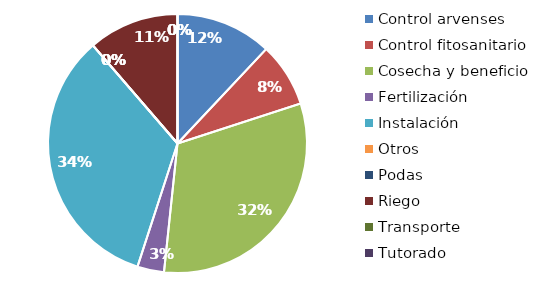
| Category | Valor |
|---|---|
| Control arvenses | 720000 |
| Control fitosanitario | 480000 |
| Cosecha y beneficio | 1900000 |
| Fertilización | 200000 |
| Instalación | 2020000 |
| Otros | 0 |
| Podas | 0 |
| Riego | 680000 |
| Transporte | 0 |
| Tutorado | 0 |